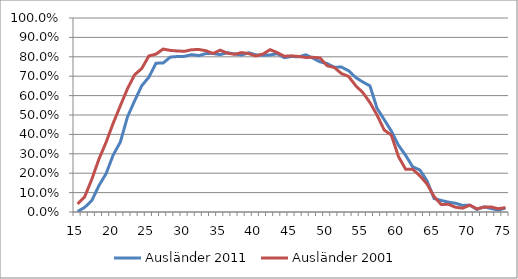
| Category | Ausländer 2011 | Ausländer 2001 |
|---|---|---|
| 15.0 | 0.003 | 0.042 |
| 16.0 | 0.024 | 0.079 |
| 17.0 | 0.059 | 0.169 |
| 18.0 | 0.137 | 0.273 |
| 19.0 | 0.198 | 0.359 |
| 20.0 | 0.294 | 0.458 |
| 21.0 | 0.361 | 0.548 |
| 22.0 | 0.49 | 0.636 |
| 23.0 | 0.573 | 0.707 |
| 24.0 | 0.651 | 0.74 |
| 25.0 | 0.695 | 0.804 |
| 26.0 | 0.767 | 0.814 |
| 27.0 | 0.768 | 0.84 |
| 28.0 | 0.798 | 0.833 |
| 29.0 | 0.801 | 0.83 |
| 30.0 | 0.802 | 0.828 |
| 31.0 | 0.811 | 0.837 |
| 32.0 | 0.806 | 0.838 |
| 33.0 | 0.817 | 0.831 |
| 34.0 | 0.816 | 0.817 |
| 35.0 | 0.811 | 0.834 |
| 36.0 | 0.821 | 0.819 |
| 37.0 | 0.815 | 0.813 |
| 38.0 | 0.809 | 0.822 |
| 39.0 | 0.821 | 0.817 |
| 40.0 | 0.81 | 0.804 |
| 41.0 | 0.808 | 0.814 |
| 42.0 | 0.81 | 0.837 |
| 43.0 | 0.816 | 0.822 |
| 44.0 | 0.795 | 0.803 |
| 45.0 | 0.802 | 0.805 |
| 46.0 | 0.8 | 0.802 |
| 47.0 | 0.81 | 0.797 |
| 48.0 | 0.793 | 0.797 |
| 49.0 | 0.774 | 0.794 |
| 50.0 | 0.765 | 0.754 |
| 51.0 | 0.746 | 0.745 |
| 52.0 | 0.747 | 0.714 |
| 53.0 | 0.728 | 0.699 |
| 54.0 | 0.693 | 0.652 |
| 55.0 | 0.67 | 0.615 |
| 56.0 | 0.65 | 0.564 |
| 57.0 | 0.534 | 0.499 |
| 58.0 | 0.476 | 0.423 |
| 59.0 | 0.417 | 0.396 |
| 60.0 | 0.344 | 0.286 |
| 61.0 | 0.292 | 0.221 |
| 62.0 | 0.233 | 0.22 |
| 63.0 | 0.216 | 0.187 |
| 64.0 | 0.161 | 0.145 |
| 65.0 | 0.069 | 0.079 |
| 66.0 | 0.06 | 0.039 |
| 67.0 | 0.051 | 0.04 |
| 68.0 | 0.045 | 0.024 |
| 69.0 | 0.034 | 0.02 |
| 70.0 | 0.035 | 0.035 |
| 71.0 | 0.013 | 0.016 |
| 72.0 | 0.027 | 0.025 |
| 73.0 | 0.018 | 0.026 |
| 74.0 | 0.01 | 0.017 |
| 75.0 | 0.02 | 0.023 |